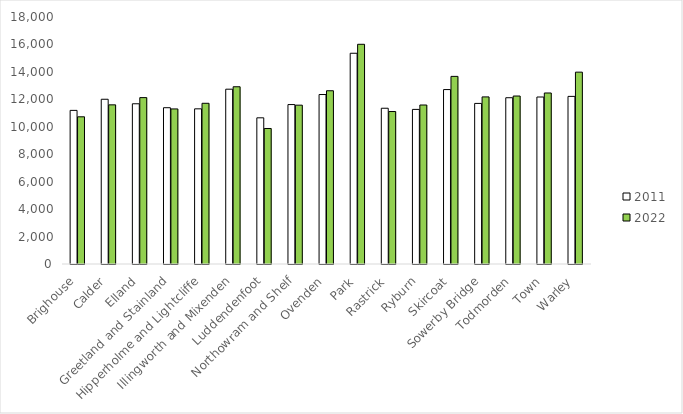
| Category | 2011 | 2022 |
|---|---|---|
| Brighouse | 11195 | 10727 |
| Calder | 12006 | 11598 |
| Elland | 11676 | 12125 |
| Greetland and Stainland | 11389 | 11301 |
| Hipperholme and Lightcliffe | 11308 | 11712 |
| Illingworth and Mixenden | 12739 | 12917 |
| Luddendenfoot | 10653 | 9875 |
| Northowram and Shelf | 11618 | 11575 |
| Ovenden | 12351 | 12626 |
| Park | 15358 | 16011 |
| Rastrick | 11351 | 11112 |
| Ryburn | 11266 | 11587 |
| Skircoat | 12712 | 13672 |
| Sowerby Bridge | 11703 | 12177 |
| Todmorden | 12117 | 12241 |
| Town | 12169 | 12462 |
| Warley | 12215 | 13981 |